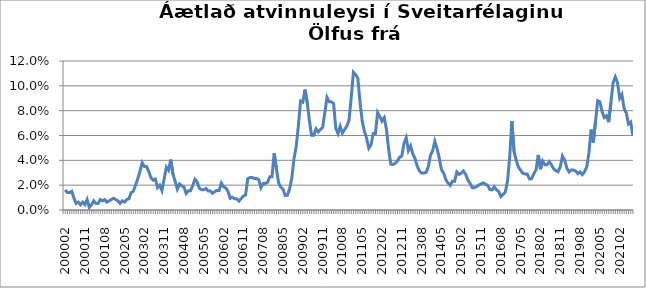
| Category | Series 0 |
|---|---|
| 200002 | 0.016 |
| 200003 | 0.014 |
| 200004 | 0.014 |
| 200005 | 0.015 |
| 200006 | 0.01 |
| 200007 | 0.005 |
| 200008 | 0.006 |
| 200009 | 0.004 |
| 200010 | 0.006 |
| 200011 | 0.004 |
| 200012 | 0.008 |
| 200101 | 0.002 |
| 200102 | 0.004 |
| 200103 | 0.007 |
| 200104 | 0.005 |
| 200105 | 0.005 |
| 200106 | 0.008 |
| 200107 | 0.007 |
| 200108 | 0.008 |
| 200109 | 0.006 |
| 200110 | 0.007 |
| 200111 | 0.008 |
| 200112 | 0.009 |
| 200201 | 0.008 |
| 200202 | 0.007 |
| 200203 | 0.005 |
| 200204 | 0.007 |
| 200205 | 0.006 |
| 200206 | 0.008 |
| 200207 | 0.009 |
| 200208 | 0.014 |
| 200209 | 0.015 |
| 200210 | 0.02 |
| 200211 | 0.025 |
| 200212 | 0.031 |
| 200301 | 0.038 |
| 200302 | 0.035 |
| 200303 | 0.035 |
| 200304 | 0.031 |
| 200305 | 0.026 |
| 200306 | 0.024 |
| 200307 | 0.025 |
| 200308 | 0.018 |
| 200309 | 0.02 |
| 200310 | 0.016 |
| 200311 | 0.025 |
| 200312 | 0.035 |
| 200401 | 0.032 |
| 200402 | 0.041 |
| 200403 | 0.029 |
| 200404 | 0.023 |
| 200405 | 0.017 |
| 200406 | 0.021 |
| 200407 | 0.019 |
| 200408 | 0.018 |
| 200409 | 0.013 |
| 200410 | 0.016 |
| 200411 | 0.016 |
| 200412 | 0.02 |
| 200501 | 0.025 |
| 200502 | 0.023 |
| 200503 | 0.018 |
| 200504 | 0.016 |
| 200505 | 0.016 |
| 200506 | 0.017 |
| 200507 | 0.015 |
| 200508 | 0.015 |
| 200509 | 0.013 |
| 200510 | 0.015 |
| 200511 | 0.016 |
| 200512 | 0.016 |
| 200601 | 0.022 |
| 200602 | 0.019 |
| 200603 | 0.018 |
| 200604 | 0.015 |
| 200605 | 0.009 |
| 200606 | 0.01 |
| 200607 | 0.009 |
| 200608 | 0.009 |
| 200609 | 0.007 |
| 200610 | 0.009 |
| 200611 | 0.011 |
| 200612 | 0.012 |
| 200701 | 0.025 |
| 200702 | 0.026 |
| 200703 | 0.026 |
| 200704 | 0.025 |
| 200705 | 0.025 |
| 200706 | 0.024 |
| 200707 | 0.018 |
| 200708 | 0.021 |
| 200709 | 0.021 |
| 200710 | 0.022 |
| 200711 | 0.027 |
| 200712 | 0.027 |
| 200801 | 0.046 |
| 200802 | 0.033 |
| 200803 | 0.022 |
| 200804 | 0.018 |
| 200805 | 0.017 |
| 200806 | 0.012 |
| 200807 | 0.012 |
| 200808 | 0.017 |
| 200809 | 0.025 |
| 200810 | 0.041 |
| 200811 | 0.051 |
| 200812 | 0.068 |
| 200901 | 0.088 |
| 200902 | 0.087 |
| 200903 | 0.097 |
| 200904 | 0.087 |
| 200905 | 0.072 |
| 200906 | 0.06 |
| 200907 | 0.06 |
| 200908 | 0.065 |
| 200909 | 0.063 |
| 200910 | 0.065 |
| 200911 | 0.066 |
| 200912 | 0.078 |
| 201001 | 0.091 |
| 201002 | 0.087 |
| 201003 | 0.087 |
| 201004 | 0.086 |
| 201005 | 0.066 |
| 201006 | 0.061 |
| 201007 | 0.067 |
| 201008 | 0.062 |
| 201009 | 0.065 |
| 201010 | 0.068 |
| 201011 | 0.072 |
| 201012 | 0.09 |
| 201101 | 0.111 |
| 201102 | 0.109 |
| 201103 | 0.106 |
| 201104 | 0.087 |
| 201105 | 0.072 |
| 201106 | 0.063 |
| 201107 | 0.058 |
| 201108 | 0.05 |
| 201109 | 0.052 |
| 201110 | 0.062 |
| 201111 | 0.062 |
| 201112 | 0.079 |
| 201201 | 0.075 |
| 201202 | 0.072 |
| 201203 | 0.074 |
| 201204 | 0.065 |
| 201205 | 0.049 |
| 201206 | 0.037 |
| 201207 | 0.037 |
| 201208 | 0.038 |
| 201209 | 0.039 |
| 201210 | 0.043 |
| 201211 | 0.043 |
| 201212 | 0.054 |
| 201301 | 0.058 |
| 201302 | 0.048 |
| 201303 | 0.052 |
| 201304 | 0.045 |
| 201305 | 0.042 |
| 201306 | 0.035 |
| 201307 | 0.032 |
| 201308 | 0.03 |
| 201309 | 0.03 |
| 201310 | 0.03 |
| 201311 | 0.035 |
| 201312 | 0.044 |
| 201401 | 0.048 |
| 201402 | 0.055 |
| 201403 | 0.05 |
| 201404 | 0.042 |
| 201405 | 0.033 |
| 201406 | 0.03 |
| 201407 | 0.024 |
| 201408 | 0.022 |
| 201409 | 0.02 |
| 201410 | 0.023 |
| 201411 | 0.023 |
| 201412 | 0.031 |
| 201501 | 0.029 |
| 201502 | 0.03 |
| 201503 | 0.031 |
| 201504 | 0.029 |
| 201505 | 0.024 |
| 201506 | 0.022 |
| 201507 | 0.018 |
| 201508 | 0.018 |
| 201509 | 0.019 |
| 201510 | 0.02 |
| 201511 | 0.021 |
| 201512 | 0.022 |
| 201601 | 0.021 |
| 201602 | 0.02 |
| 201603 | 0.016 |
| 201604 | 0.016 |
| 201605 | 0.019 |
| 201606 | 0.016 |
| 201607 | 0.015 |
| 201608 | 0.011 |
| 201609 | 0.013 |
| 201610 | 0.014 |
| 201611 | 0.023 |
| 201612 | 0.042 |
| 201701 | 0.072 |
| 201702 | 0.047 |
| 201703 | 0.04 |
| 201704 | 0.035 |
| 201705 | 0.032 |
| 201706 | 0.029 |
| 201707 | 0.029 |
| 201708 | 0.029 |
| 201709 | 0.025 |
| 201710 | 0.025 |
| 201711 | 0.029 |
| 201712 | 0.032 |
| 201801 | 0.044 |
| 201802 | 0.033 |
| 201803 | 0.039 |
| 201804 | 0.036 |
| 201805 | 0.036 |
| 201806 | 0.039 |
| 201807 | 0.036 |
| 201808 | 0.033 |
| 201809 | 0.032 |
| 201810 | 0.031 |
| 201811 | 0.035 |
| 201812 | 0.043 |
| 201901 | 0.04 |
| 201902 | 0.034 |
| 201903 | 0.031 |
| 201904 | 0.032 |
| 201905 | 0.032 |
| 201906 | 0.031 |
| 201907 | 0.029 |
| 201908 | 0.031 |
| 201909 | 0.028 |
| 201910 | 0.031 |
| 201911 | 0.035 |
| 201912 | 0.046 |
| 202001 | 0.065 |
| 202002 | 0.054 |
| 202003 | 0.071 |
| 202004 | 0.088 |
| 202005 | 0.087 |
| 202006 | 0.079 |
| 202007 | 0.074 |
| 202008 | 0.076 |
| 202009 | 0.071 |
| 202010 | 0.086 |
| 202011 | 0.103 |
| 202012 | 0.107 |
| 202101 | 0.102 |
| 202102 | 0.09 |
| 202103 | 0.093 |
| 202104 | 0.082 |
| 202105 | 0.078 |
| 202106 | 0.069 |
| 202107 | 0.071 |
| 202108 | 0.06 |